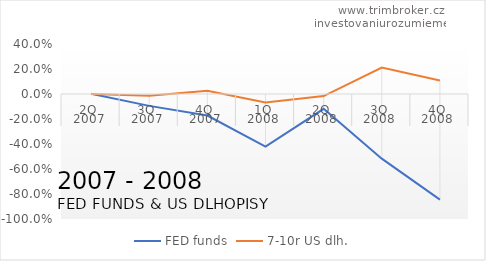
| Category | FED funds | 7-10r US dlh. |
|---|---|---|
| 0 | 0.002 | -0.001 |
| 1 | -0.095 | -0.013 |
| 2 | -0.172 | 0.025 |
| 3 | -0.421 | -0.067 |
| 4 | -0.118 | -0.016 |
| 5 | -0.517 | 0.211 |
| 6 | -0.845 | 0.109 |